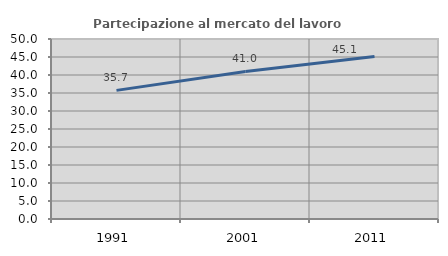
| Category | Partecipazione al mercato del lavoro  femminile |
|---|---|
| 1991.0 | 35.726 |
| 2001.0 | 41 |
| 2011.0 | 45.11 |